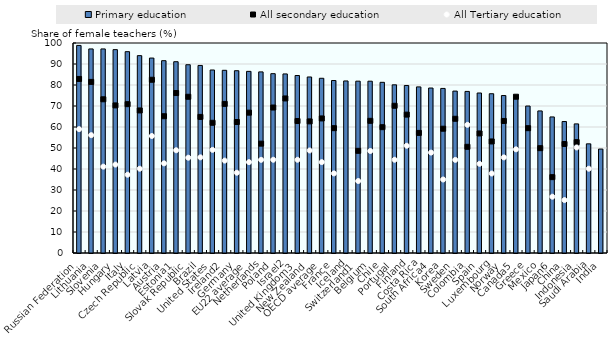
| Category | Primary education |
|---|---|
| Russian Federation | 98.843 |
| Lithuania | 97.179 |
| Slovenia | 97.177 |
| Hungary | 96.844 |
| Italy | 95.872 |
| Czech Republic | 93.984 |
| Latvia | 92.835 |
| Austria | 91.579 |
| Estonia1 | 91.091 |
| Slovak Republic | 89.656 |
| Brazil | 89.311 |
| United States | 87.148 |
| Ireland2 | 86.999 |
| Germany | 86.801 |
| EU22 average | 86.492 |
| Netherlands | 86.248 |
| Poland | 85.399 |
| Israel2 | 85.275 |
| United Kingdom3 | 84.518 |
| New Zealand | 83.824 |
| OECD average | 83.205 |
| France | 82.135 |
| Iceland | 81.927 |
| Switzerland1 | 81.825 |
| Belgium | 81.81 |
| Chile | 81.274 |
| Portugal | 80.075 |
| Finland | 79.771 |
| Costa Rica | 79.105 |
| South Africa4 | 78.56 |
| Korea | 78.369 |
| Sweden | 77.105 |
| Colombia | 76.944 |
| Spain | 76.186 |
| Luxembourg | 75.842 |
| Norway | 74.98 |
| Canada5 | 74.399 |
| Greece | 69.989 |
| Mexico | 67.656 |
| Japan6 | 64.792 |
| China | 62.597 |
| Indonesia | 61.487 |
| Saudi Arabia | 51.981 |
| India | 49.49 |